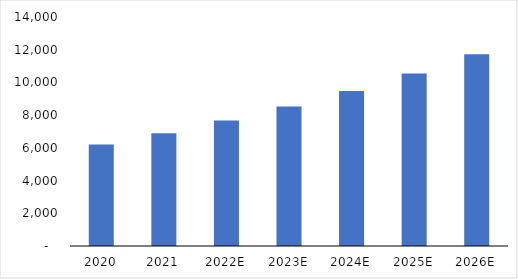
| Category | Series 0 |
|---|---|
| 2020 | 6200 |
| 2021 | 6894.4 |
| 2022E | 7666.573 |
| 2023E | 8525.229 |
| 2024E | 9480.055 |
| 2025E | 10541.821 |
| 2026E | 11722.505 |